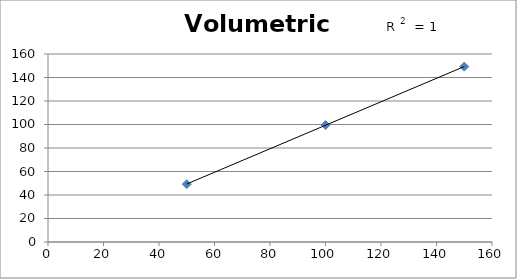
| Category | Mass of Water (g) |
|---|---|
| 50.0 | 49.26 |
| 100.0 | 99.53 |
| 150.0 | 149.24 |